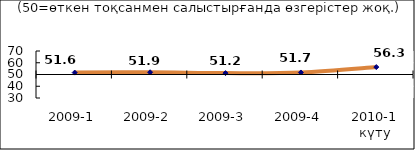
| Category | Диф.индекс ↓ |
|---|---|
| 2009-1 | 51.625 |
| 2009-2 | 51.895 |
| 2009-3 | 51.195 |
| 2009-4 | 51.725 |
| 2010-1 күту | 56.32 |